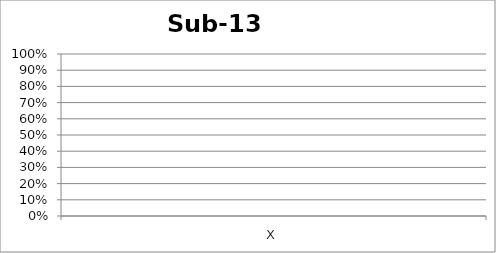
| Category | Sub-13 |
|---|---|
| X | 0 |